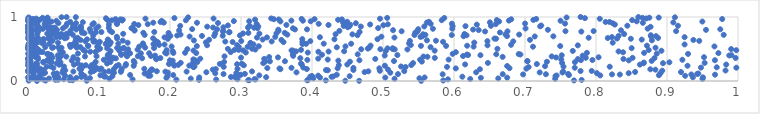
| Category | Series 0 |
|---|---|
| 0.012581434079411397 | 0.001 |
| 0.5538194736224774 | 0.002 |
| 0.4664493394655366 | 0.003 |
| 0.4468543801785446 | 0.004 |
| 0.08261566202539482 | 0.005 |
| 0.0010166043889414363 | 0.006 |
| 0.024758491668473725 | 0.007 |
| 0.5847515967661855 | 0.008 |
| 0.7690344453760237 | 0.009 |
| 0.41945659897998555 | 0.01 |
| 0.3933090043632396 | 0.011 |
| 0.06285149333932596 | 0.012 |
| 0.3113833984330481 | 0.013 |
| 0.310170372640802 | 0.014 |
| 0.05865643473802186 | 0.015 |
| 0.39425686358414147 | 0.016 |
| 0.7797838025706793 | 0.017 |
| 0.03859763547927318 | 0.018 |
| 0.24080832496385804 | 0.019 |
| 0.04246517612462469 | 0.02 |
| 0.2089240261262518 | 0.021 |
| 0.02197612507937619 | 0.022 |
| 0.2650255789797198 | 0.023 |
| 0.3203731093125201 | 0.024 |
| 0.14731440239198895 | 0.025 |
| 0.5914334222539293 | 0.026 |
| 0.29498436131448014 | 0.027 |
| 0.050445300946891626 | 0.028 |
| 0.31902909096392407 | 0.029 |
| 0.012850995288153987 | 0.03 |
| 0.6228479075087195 | 0.031 |
| 0.950010506703682 | 0.032 |
| 0.1146795055342006 | 0.033 |
| 0.7425315621230358 | 0.034 |
| 0.5162380187441156 | 0.035 |
| 0.0033428228536305114 | 0.036 |
| 0.01747380808025769 | 0.037 |
| 0.22919382733326896 | 0.038 |
| 0.029613520234972913 | 0.039 |
| 0.6623364581365054 | 0.04 |
| 0.007069242463207229 | 0.041 |
| 0.40186333689762455 | 0.042 |
| 0.551297612471121 | 0.043 |
| 0.012989911877206434 | 0.044 |
| 0.08720304127235276 | 0.045 |
| 0.00706980782309655 | 0.046 |
| 0.0029586530379909987 | 0.047 |
| 0.06806486046594251 | 0.048 |
| 0.6378143108307986 | 0.049 |
| 0.1949242988515982 | 0.05 |
| 0.00017795972893022713 | 0.051 |
| 0.6749065318323275 | 0.052 |
| 0.41139221672633464 | 0.053 |
| 0.503280811965432 | 0.054 |
| 0.5585929923488544 | 0.055 |
| 0.24119429200655532 | 0.056 |
| 0.9506356673355246 | 0.057 |
| 0.9364822103862095 | 0.058 |
| 0.0005937504475656386 | 0.059 |
| 0.3354318650730736 | 0.06 |
| 0.05950167390177529 | 0.061 |
| 0.04240312464686263 | 0.062 |
| 0.2858547062032555 | 0.063 |
| 0.07508410018639351 | 0.064 |
| 0.2907413889545441 | 0.065 |
| 0.42751740025988744 | 0.066 |
| 0.6117655469948821 | 0.067 |
| 0.39749271699452754 | 0.068 |
| 0.10890117142855124 | 0.069 |
| 0.10730151094975639 | 0.07 |
| 0.42988067750121084 | 0.071 |
| 0.07989425513882156 | 0.072 |
| 0.03745684691579967 | 0.073 |
| 0.1188334101952559 | 0.074 |
| 0.4530114622472979 | 0.075 |
| 0.7429023975543911 | 0.076 |
| 0.19647130532613596 | 0.077 |
| 0.39993865691761016 | 0.078 |
| 0.01633262687449137 | 0.079 |
| 0.16963053016370105 | 0.08 |
| 0.9255765031332096 | 0.081 |
| 0.03853822289271652 | 0.082 |
| 0.17221440593889042 | 0.083 |
| 0.4087745203561707 | 0.084 |
| 0.05215563329953348 | 0.085 |
| 0.7445801615364339 | 0.086 |
| 0.8059731122825438 | 0.087 |
| 0.3257499675803352 | 0.088 |
| 0.10204851133703091 | 0.089 |
| 0.8886149886724063 | 0.09 |
| 0.07744483613944522 | 0.091 |
| 0.7619290545455858 | 0.092 |
| 0.20453517952880634 | 0.093 |
| 0.14381610714956128 | 0.094 |
| 0.2974567895285575 | 0.095 |
| 0.2995397390967571 | 0.096 |
| 0.03843459295786345 | 0.097 |
| 0.4348947528751762 | 0.098 |
| 0.9676483794696745 | 0.099 |
| 0.008055413522605038 | 0.1 |
| 0.8335623716036511 | 0.101 |
| 0.9342890892012924 | 0.102 |
| 0.6973431486477115 | 0.103 |
| 0.8225620943025177 | 0.104 |
| 0.5840497402832733 | 0.105 |
| 0.7295063762891945 | 0.106 |
| 0.668655944358996 | 0.107 |
| 0.5211262440573501 | 0.108 |
| 0.2754180118546329 | 0.109 |
| 0.7608063385233927 | 0.11 |
| 0.9425319611843659 | 0.111 |
| 0.3054265766629343 | 0.112 |
| 0.07494758263449297 | 0.113 |
| 0.02085284153053956 | 0.114 |
| 0.03620909485804156 | 0.115 |
| 0.9441923524318065 | 0.116 |
| 0.1642816373743866 | 0.117 |
| 0.007417860769580063 | 0.118 |
| 0.040691293494025865 | 0.119 |
| 0.8906998287350578 | 0.12 |
| 0.2637165760580508 | 0.121 |
| 0.8460575308191575 | 0.122 |
| 0.8012734279430845 | 0.123 |
| 0.16917298104304904 | 0.124 |
| 0.01714159025865894 | 0.125 |
| 0.29346674398212746 | 0.126 |
| 0.024049655183445533 | 0.127 |
| 0.12108354938659473 | 0.128 |
| 0.11964376175294074 | 0.129 |
| 0.5102932257623926 | 0.13 |
| 0.048472913450156516 | 0.131 |
| 0.1969455250620777 | 0.132 |
| 0.7527511213553173 | 0.133 |
| 0.7207196398709985 | 0.134 |
| 0.378145506992356 | 0.135 |
| 0.631197691657521 | 0.136 |
| 0.2512180726015382 | 0.137 |
| 0.08848176027001367 | 0.138 |
| 0.47411784371210614 | 0.139 |
| 0.9196904304702097 | 0.14 |
| 0.8550762286663652 | 0.141 |
| 0.10739566346987751 | 0.142 |
| 0.1307888737396675 | 0.143 |
| 0.00030816658246248126 | 0.144 |
| 0.0007032087130229858 | 0.145 |
| 0.19347935526516907 | 0.146 |
| 0.22338583921236957 | 0.147 |
| 0.06389154103413666 | 0.148 |
| 0.7537548980069192 | 0.149 |
| 0.3155518724068487 | 0.15 |
| 0.4793322341884036 | 0.151 |
| 0.18142549004612657 | 0.152 |
| 0.11377062968566096 | 0.153 |
| 0.5299308196030017 | 0.154 |
| 0.09205335238922135 | 0.155 |
| 0.7782153040349252 | 0.156 |
| 0.7939581275133886 | 0.157 |
| 0.17255612345021165 | 0.158 |
| 0.4955845056315014 | 0.159 |
| 0.09206612383884193 | 0.16 |
| 0.8933776172150731 | 0.161 |
| 0.13128149056429153 | 0.162 |
| 0.00019791458523630412 | 0.163 |
| 0.9824238294439412 | 0.164 |
| 0.0049687484273614885 | 0.165 |
| 0.0007911338053830643 | 0.166 |
| 0.05247410602832227 | 0.167 |
| 0.4222983018533972 | 0.168 |
| 0.01004101453171678 | 0.169 |
| 0.049634733170429754 | 0.17 |
| 0.41968921832171285 | 0.171 |
| 0.458264008298881 | 0.172 |
| 0.022218914908795684 | 0.173 |
| 0.012593616295164808 | 0.174 |
| 0.07455026880846499 | 0.175 |
| 0.1750818903087035 | 0.176 |
| 0.8836827338228469 | 0.177 |
| 0.2601874250853314 | 0.178 |
| 0.095178963984406 | 0.179 |
| 0.5069773890742963 | 0.18 |
| 0.17397302961643638 | 0.181 |
| 0.10071915651797418 | 0.182 |
| 0.876557068386204 | 0.183 |
| 0.6365037242309203 | 0.184 |
| 0.355502003406669 | 0.185 |
| 0.26454042890048035 | 0.186 |
| 0.3927389987936996 | 0.187 |
| 0.12111307415190836 | 0.188 |
| 0.29503306386297123 | 0.189 |
| 0.16379316620132925 | 0.19 |
| 0.13212216149486988 | 0.191 |
| 0.07251520500274967 | 0.192 |
| 0.7019222432567591 | 0.193 |
| 0.016913743210987812 | 0.194 |
| 0.10330275681175444 | 0.195 |
| 0.3542050630829755 | 0.196 |
| 0.6025401008303343 | 0.197 |
| 0.4948373451801721 | 0.198 |
| 0.43609644825435645 | 0.199 |
| 0.6781635577964578 | 0.2 |
| 0.008213165632396205 | 0.201 |
| 0.3370230214315787 | 0.202 |
| 0.03575453223931389 | 0.203 |
| 0.09672280842865198 | 0.204 |
| 0.45834518517073625 | 0.205 |
| 0.37112105195757855 | 0.206 |
| 0.7700771322013626 | 0.207 |
| 0.9976909936810304 | 0.208 |
| 0.9478475068172126 | 0.209 |
| 0.38771288679712407 | 0.21 |
| 0.006269122789394137 | 0.211 |
| 0.09240299450096585 | 0.212 |
| 0.07610678991241801 | 0.213 |
| 0.9700665767342941 | 0.214 |
| 0.00905527867136349 | 0.215 |
| 0.08792609948814124 | 0.216 |
| 0.23304592974763955 | 0.217 |
| 0.7051339452213632 | 0.218 |
| 0.531778154267415 | 0.219 |
| 0.590164816329501 | 0.22 |
| 0.27565835263729793 | 0.221 |
| 0.23364495212235062 | 0.222 |
| 0.8193492968030194 | 0.223 |
| 0.026281994100187556 | 0.224 |
| 0.7542313132704289 | 0.225 |
| 0.050701993484478576 | 0.226 |
| 0.5254403621727769 | 0.227 |
| 0.23449056243968408 | 0.228 |
| 0.03179812260704799 | 0.229 |
| 0.012482196371142487 | 0.23 |
| 0.07642437205369088 | 0.231 |
| 0.7282040830829382 | 0.232 |
| 0.12437340004297491 | 0.233 |
| 0.6748804849560749 | 0.234 |
| 0.010089866754524281 | 0.235 |
| 0.008921516322956347 | 0.236 |
| 0.1488743014055665 | 0.237 |
| 0.9288767307330449 | 0.238 |
| 0.5026469201038923 | 0.239 |
| 0.2061158629732965 | 0.24 |
| 0.2271703796641308 | 0.241 |
| 0.0754952279919915 | 0.242 |
| 0.13750996452744152 | 0.243 |
| 1.0445862282019075e-05 | 0.244 |
| 0.3040107439965842 | 0.245 |
| 0.08139553673333146 | 0.246 |
| 0.08971984596676692 | 0.247 |
| 0.43781422514903306 | 0.248 |
| 0.5397913389932462 | 0.249 |
| 0.12752032922379705 | 0.25 |
| 0.21151289592831607 | 0.251 |
| 0.20574674978989657 | 0.252 |
| 0.0037786057623916984 | 0.253 |
| 0.043865878890794824 | 0.254 |
| 0.06465621029014179 | 0.255 |
| 0.861827787427295 | 0.256 |
| 0.9834147403019973 | 0.257 |
| 0.44968844010401665 | 0.258 |
| 0.6156592695310202 | 0.259 |
| 0.38554434213948185 | 0.26 |
| 0.0016049904433711427 | 0.261 |
| 0.2944924626190693 | 0.262 |
| 0.044895342461789556 | 0.263 |
| 0.1379845442423468 | 0.264 |
| 0.71667105620725 | 0.265 |
| 0.19854395430168315 | 0.266 |
| 0.2701784735666394 | 0.267 |
| 0.0934605409516154 | 0.268 |
| 0.012709532093430021 | 0.269 |
| 0.30129828007722287 | 0.27 |
| 0.3844878306602717 | 0.271 |
| 0.011348462604640196 | 0.272 |
| 0.11140002536359822 | 0.273 |
| 0.0017135785463877565 | 0.274 |
| 0.07010343499366992 | 0.275 |
| 0.04045470850809035 | 0.276 |
| 0.8670108793037671 | 0.277 |
| 0.8944050516218193 | 0.278 |
| 0.3313562370627558 | 0.279 |
| 0.5423232985950744 | 0.28 |
| 0.7522809356274591 | 0.281 |
| 0.6477664904211448 | 0.282 |
| 0.9530221476488419 | 0.283 |
| 0.21510017183267277 | 0.284 |
| 0.15007701477251098 | 0.285 |
| 0.00020541943689425952 | 0.286 |
| 0.23251464391297202 | 0.287 |
| 0.8674258255197851 | 0.288 |
| 0.03336421455437137 | 0.289 |
| 0.021587630161964983 | 0.29 |
| 0.003101034948556946 | 0.291 |
| 0.9033552173611546 | 0.292 |
| 0.0014747706429798545 | 0.293 |
| 0.04567055234585086 | 0.294 |
| 0.7703513923870143 | 0.295 |
| 0.2384293709471788 | 0.296 |
| 0.11605669080383997 | 0.297 |
| 0.27621992669076423 | 0.298 |
| 0.021661066042526267 | 0.299 |
| 0.09525375170481956 | 0.3 |
| 0.730881959087536 | 0.301 |
| 0.4534629626353132 | 0.302 |
| 0.5547066921038231 | 0.303 |
| 0.03226021643383538 | 0.304 |
| 0.031098304707074448 | 0.305 |
| 0.33445228064160254 | 0.306 |
| 0.34072013177476845 | 0.307 |
| 0.003687166493080831 | 0.308 |
| 0.36192826323732635 | 0.309 |
| 0.7032047552450537 | 0.31 |
| 0.7034611487784266 | 0.311 |
| 0.5154997416480286 | 0.312 |
| 0.14893198189567652 | 0.313 |
| 0.8784403753174854 | 0.314 |
| 0.002994644461445537 | 0.315 |
| 0.02743870202164287 | 0.316 |
| 0.20376953967744077 | 0.317 |
| 0.4370883684464224 | 0.318 |
| 0.2351228697374031 | 0.319 |
| 0.06162834432871178 | 0.32 |
| 0.2358072134558691 | 0.321 |
| 0.8461487921980668 | 0.322 |
| 0.19978473921829235 | 0.323 |
| 0.4668154677361719 | 0.324 |
| 0.967493819960503 | 0.325 |
| 0.7787911060338366 | 0.326 |
| 0.02759594610872393 | 0.327 |
| 0.7950054861749652 | 0.328 |
| 0.0004465230384604553 | 0.329 |
| 0.39342933611852926 | 0.33 |
| 0.10681438797112862 | 0.331 |
| 0.9216555226761676 | 0.332 |
| 0.5522815938946576 | 0.333 |
| 0.592440581276513 | 0.334 |
| 0.4221631609763822 | 0.335 |
| 0.06981611677677754 | 0.336 |
| 0.7510920062203723 | 0.337 |
| 0.2329031270697404 | 0.338 |
| 0.043131607558559715 | 0.339 |
| 0.02932825370022123 | 0.34 |
| 0.18073186651716092 | 0.341 |
| 0.014140072820743008 | 0.342 |
| 0.7744070319260378 | 0.343 |
| 0.8386982987757198 | 0.344 |
| 0.48908951411621715 | 0.345 |
| 0.3326660552236945 | 0.346 |
| 6.656076544925635e-05 | 0.347 |
| 0.11406214036593443 | 0.348 |
| 0.24263252972400137 | 0.349 |
| 0.4087914205618755 | 0.35 |
| 0.043109418887151287 | 0.351 |
| 0.18018247182776514 | 0.352 |
| 0.0002474622673515646 | 0.353 |
| 0.12381045866316374 | 0.354 |
| 0.1200430799244422 | 0.355 |
| 0.16070399890359674 | 0.356 |
| 0.38353351999559265 | 0.357 |
| 0.8824043456850096 | 0.358 |
| 0.18646406109542427 | 0.359 |
| 0.9966589295763052 | 0.36 |
| 0.572939847427444 | 0.361 |
| 0.8515424826437293 | 0.362 |
| 0.7856296713658288 | 0.363 |
| 0.1197401166045033 | 0.364 |
| 0.30007365274201936 | 0.365 |
| 0.03439498095645414 | 0.366 |
| 0.013772520890541515 | 0.367 |
| 0.743748578249055 | 0.368 |
| 0.35209512480684324 | 0.369 |
| 0.004468867543278422 | 0.37 |
| 0.8036354603194487 | 0.371 |
| 0.9521508502421042 | 0.372 |
| 0.06401637506073996 | 0.373 |
| 0.33967702578897635 | 0.374 |
| 0.010355571030661745 | 0.375 |
| 0.04508086627528332 | 0.376 |
| 0.6684908133844412 | 0.377 |
| 0.11389437108310903 | 0.378 |
| 0.5625976615770862 | 0.379 |
| 0.11232155790429857 | 0.38 |
| 0.05395426237932181 | 0.381 |
| 0.5569553580433962 | 0.382 |
| 0.08022651498934324 | 0.383 |
| 0.7376017941642897 | 0.384 |
| 0.27677606553775275 | 0.385 |
| 0.13952653481358818 | 0.386 |
| 0.09646579815983286 | 0.387 |
| 0.15471870812352548 | 0.388 |
| 0.046268142412812525 | 0.389 |
| 0.6127848641716116 | 0.39 |
| 0.17310154419938947 | 0.391 |
| 0.04589232805736358 | 0.392 |
| 0.37345852389487033 | 0.393 |
| 0.03272123451292149 | 0.394 |
| 0.002506862376250571 | 0.395 |
| 0.7812178474649258 | 0.396 |
| 0.1790197568071549 | 0.397 |
| 0.5024272716739664 | 0.398 |
| 0.9876825223499335 | 0.399 |
| 0.04481906724936492 | 0.4 |
| 0.04192986303514519 | 0.401 |
| 0.7517381867672586 | 0.402 |
| 0.6372333019358342 | 0.403 |
| 0.9908105489940554 | 0.404 |
| 0.520239265411293 | 0.405 |
| 0.6198336424333483 | 0.406 |
| 0.11236305345754818 | 0.407 |
| 0.004752807901323878 | 0.408 |
| 0.032174931042634615 | 0.409 |
| 0.41407933117568163 | 0.41 |
| 0.1313890213092158 | 0.411 |
| 0.13123459325368328 | 0.412 |
| 0.6182104840797802 | 0.413 |
| 0.6935832758249357 | 0.414 |
| 0.0021480030658952813 | 0.415 |
| 0.37300040767077497 | 0.416 |
| 0.4643751109635483 | 0.417 |
| 0.659506089727157 | 0.418 |
| 0.13743749722465795 | 0.419 |
| 0.027043025698371224 | 0.42 |
| 0.691160357315924 | 0.421 |
| 0.11427622246771706 | 0.422 |
| 0.9296571233368158 | 0.423 |
| 0.5981330360997653 | 0.424 |
| 0.028119640798217833 | 0.425 |
| 0.0002009990864660178 | 0.426 |
| 0.01217153817379515 | 0.427 |
| 0.885616826445664 | 0.428 |
| 0.07034174103967981 | 0.429 |
| 0.19505724323839568 | 0.43 |
| 0.012013646669209838 | 0.431 |
| 0.1437915876516646 | 0.432 |
| 0.1590108802303371 | 0.433 |
| 0.1706204582970935 | 0.434 |
| 0.13816011721006657 | 0.435 |
| 0.9724310081831574 | 0.436 |
| 0.23691609521807058 | 0.437 |
| 0.20470208577388055 | 0.438 |
| 0.867745930549284 | 0.439 |
| 0.7872069789573993 | 0.44 |
| 0.22125430911395527 | 0.441 |
| 0.19319045854514225 | 0.442 |
| 0.0025548147577089376 | 0.443 |
| 0.394049941967496 | 0.444 |
| 0.3067838154748878 | 0.445 |
| 0.049140962300966755 | 0.446 |
| 0.04740776625635126 | 0.447 |
| 0.01058862270592869 | 0.448 |
| 0.8381170848086897 | 0.449 |
| 0.6025576612046633 | 0.45 |
| 0.2855176218928045 | 0.451 |
| 0.00819933781035038 | 0.452 |
| 0.02058288452901869 | 0.453 |
| 0.017713396959299365 | 0.454 |
| 0.09494452874858109 | 0.455 |
| 0.010276128993937799 | 0.456 |
| 0.40900252537097126 | 0.457 |
| 0.08766161976650044 | 0.458 |
| 0.012479987009747196 | 0.459 |
| 0.42334428810149327 | 0.46 |
| 0.012152537842538755 | 0.461 |
| 0.8317808661933186 | 0.462 |
| 0.37743278932767166 | 0.463 |
| 0.0806281028657759 | 0.464 |
| 0.44530155451471165 | 0.465 |
| 0.2038002487265977 | 0.466 |
| 0.5037801685450544 | 0.467 |
| 0.11625612037177725 | 0.468 |
| 0.008896700845244802 | 0.469 |
| 0.7673189028618945 | 0.47 |
| 0.00242815930355924 | 0.471 |
| 0.12896710268666922 | 0.472 |
| 0.8921893313986502 | 0.473 |
| 0.572739849540714 | 0.474 |
| 0.3731235103510928 | 0.475 |
| 0.2330830547865501 | 0.476 |
| 0.3711696390886404 | 0.477 |
| 0.3031131323600161 | 0.478 |
| 0.12868455587957317 | 0.479 |
| 0.044938784270863515 | 0.48 |
| 0.9975912065275934 | 0.481 |
| 0.1952520906342035 | 0.482 |
| 0.01526319306662169 | 0.483 |
| 0.8742608258371111 | 0.484 |
| 0.29061953511145777 | 0.485 |
| 0.3845560751766525 | 0.486 |
| 0.2967929493725396 | 0.487 |
| 0.09841175916320871 | 0.488 |
| 0.07762584833919736 | 0.489 |
| 0.00349198992869359 | 0.49 |
| 0.15431354007370238 | 0.491 |
| 0.32020405068746866 | 0.492 |
| 0.5344027233279114 | 0.493 |
| 0.5165208642228036 | 0.494 |
| 0.14111723920776748 | 0.495 |
| 0.46933223064426666 | 0.496 |
| 0.4962392417294962 | 0.497 |
| 0.22438194483216348 | 0.498 |
| 0.9903812328238426 | 0.499 |
| 0.5137497339261514 | 0.5 |
| 2.7008185686056273e-05 | 0.501 |
| 0.28153916201578244 | 0.502 |
| 0.6611341630540511 | 0.503 |
| 0.3156281091034099 | 0.504 |
| 0.10152237348559821 | 0.505 |
| 0.0040185111034804185 | 0.506 |
| 0.4785731100549961 | 0.507 |
| 0.01275221395232401 | 0.508 |
| 0.12876295802490498 | 0.509 |
| 0.506373796323686 | 0.51 |
| 0.11150051045320426 | 0.511 |
| 0.5136612438339421 | 0.512 |
| 0.8501841192561295 | 0.513 |
| 0.13427067318379873 | 0.514 |
| 0.17750177741452888 | 0.515 |
| 0.1351015258194117 | 0.516 |
| 0.1254934068711205 | 0.517 |
| 0.03396756258523213 | 0.518 |
| 0.047177826324810795 | 0.519 |
| 0.8837845808344583 | 0.52 |
| 0.1649663270376515 | 0.521 |
| 0.06863114998302072 | 0.522 |
| 0.4808786387570427 | 0.523 |
| 0.002460079075891721 | 0.524 |
| 0.035555149765196 | 0.525 |
| 0.04266070073898387 | 0.526 |
| 0.43497534469335974 | 0.527 |
| 1.2544516635403586e-07 | 0.528 |
| 0.5669531909403002 | 0.529 |
| 0.024230233264587064 | 0.53 |
| 0.07365741823756292 | 0.531 |
| 0.05989838035207977 | 0.532 |
| 0.29678771653183184 | 0.533 |
| 0.3092935831956216 | 0.534 |
| 0.09755744337168039 | 0.535 |
| 0.7112406077316628 | 0.536 |
| 0.6275789455882548 | 0.537 |
| 0.15667128890908796 | 0.538 |
| 0.2022929945652702 | 0.539 |
| 0.9668318937678789 | 0.54 |
| 0.4471602349456463 | 0.541 |
| 0.007158359396786757 | 0.542 |
| 0.3250597933319224 | 0.543 |
| 0.06679188244616846 | 0.544 |
| 0.23781483222348096 | 0.545 |
| 0.7495868689592525 | 0.546 |
| 0.08491500479900416 | 0.547 |
| 0.5888399264566122 | 0.548 |
| 0.5534989940863848 | 0.549 |
| 0.084333786016948 | 0.55 |
| 0.6184853679264245 | 0.551 |
| 0.8717419712289797 | 0.552 |
| 0.48256061360485875 | 0.553 |
| 0.0022643504629409708 | 0.554 |
| 0.001393659765065636 | 0.555 |
| 0.0003551639812996333 | 0.556 |
| 0.7743730413020442 | 0.557 |
| 0.6471518247359833 | 0.558 |
| 0.25221168967661184 | 0.559 |
| 0.29447501344344956 | 0.56 |
| 0.06071776375538645 | 0.561 |
| 0.5391902536226146 | 0.562 |
| 0.05904869893271577 | 0.563 |
| 0.18458615419384505 | 0.564 |
| 0.680373486930137 | 0.565 |
| 0.16257958559907712 | 0.566 |
| 0.06487797204990436 | 0.567 |
| 0.008782193819954418 | 0.568 |
| 0.11484905529178632 | 0.569 |
| 0.19229662240876905 | 0.57 |
| 0.9247848647922338 | 0.571 |
| 0.3175909563628653 | 0.572 |
| 0.06770850331749349 | 0.573 |
| 0.1783673726043274 | 0.574 |
| 0.0990024264458998 | 0.575 |
| 0.17670804564788734 | 0.576 |
| 0.3865960422370373 | 0.577 |
| 0.10949342563198959 | 0.578 |
| 0.000989182187304789 | 0.579 |
| 0.02987968440184631 | 0.58 |
| 0.39168157590226577 | 0.581 |
| 0.4551325342378195 | 0.582 |
| 0.41655371071751707 | 0.583 |
| 0.1272111597671132 | 0.584 |
| 0.009866565435641765 | 0.585 |
| 0.18077922718857978 | 0.586 |
| 0.16191557971092477 | 0.587 |
| 0.5366589488966552 | 0.588 |
| 0.020338746201053443 | 0.589 |
| 0.31344856270863425 | 0.59 |
| 0.011786713459685861 | 0.591 |
| 0.11037453890010082 | 0.592 |
| 0.0016282190820744104 | 0.593 |
| 0.021798823523156007 | 0.594 |
| 0.06641469909709989 | 0.595 |
| 0.31343516434341 | 0.596 |
| 0.042316357180012705 | 0.597 |
| 0.14037198915000684 | 0.598 |
| 0.823555226854701 | 0.599 |
| 0.6285663034177729 | 0.6 |
| 0.003601301222149551 | 0.601 |
| 0.06698275664581305 | 0.602 |
| 0.11646620165288518 | 0.603 |
| 0.2504900441494716 | 0.604 |
| 0.018384924853377255 | 0.605 |
| 0.18291617559522483 | 0.606 |
| 0.0205472579334403 | 0.607 |
| 0.35988388747443034 | 0.608 |
| 0.288236492426218 | 0.609 |
| 0.3865054170076506 | 0.61 |
| 0.006356606861371437 | 0.611 |
| 0.5845867980003674 | 0.612 |
| 0.10107999734058767 | 0.613 |
| 0.11429711298186963 | 0.614 |
| 0.09222061873638505 | 0.615 |
| 0.2778427749879723 | 0.616 |
| 0.06682907419793709 | 0.617 |
| 0.3431984962523807 | 0.618 |
| 0.6834468831869052 | 0.619 |
| 0.09465053112679285 | 0.62 |
| 0.08068737267103566 | 0.621 |
| 0.6470460667415584 | 0.622 |
| 0.3976502557528335 | 0.623 |
| 0.032840106020423046 | 0.624 |
| 0.30037088366421955 | 0.625 |
| 0.5379453735466224 | 0.626 |
| 0.9454120776841335 | 0.627 |
| 0.1797804890886285 | 0.628 |
| 0.5745880568345424 | 0.629 |
| 0.034590561083727225 | 0.63 |
| 0.13347956701232336 | 0.631 |
| 0.11318219854041743 | 0.632 |
| 0.007390454499906745 | 0.633 |
| 0.23367487317768787 | 0.634 |
| 0.5618826347096296 | 0.635 |
| 0.8787247460522393 | 0.636 |
| 0.004149392503423834 | 0.637 |
| 0.03247141949898762 | 0.638 |
| 0.01122244191639832 | 0.639 |
| 0.07397850667725289 | 0.64 |
| 0.9371761400002959 | 0.641 |
| 0.35690486051685494 | 0.642 |
| 0.7070353665914396 | 0.643 |
| 0.25516841272942853 | 0.644 |
| 0.009990665289809929 | 0.645 |
| 0.0019375580730130384 | 0.646 |
| 0.8644472061929568 | 0.647 |
| 0.3304736327842714 | 0.648 |
| 0.11239323489567546 | 0.649 |
| 0.021442848956863787 | 0.65 |
| 0.08317411043244576 | 0.651 |
| 0.4316090501026717 | 0.652 |
| 0.4922264135192865 | 0.653 |
| 0.022353067133414083 | 0.654 |
| 0.3863267890785989 | 0.655 |
| 0.09133450579647451 | 0.656 |
| 0.06870456982249741 | 0.657 |
| 0.0008780833515450106 | 0.658 |
| 0.19690913291779344 | 0.659 |
| 0.8490517861426911 | 0.66 |
| 0.6593474749006861 | 0.661 |
| 0.0672930550688723 | 0.662 |
| 0.656973286868629 | 0.663 |
| 0.8296789203671258 | 0.664 |
| 0.12559122655190777 | 0.665 |
| 0.028359065404842072 | 0.666 |
| 0.17626860270188777 | 0.667 |
| 0.05185000204047743 | 0.668 |
| 0.0002537138240304748 | 0.669 |
| 0.014028585284681918 | 0.67 |
| 0.8165981850776994 | 0.671 |
| 0.003101087926222741 | 0.672 |
| 0.887417535678209 | 0.673 |
| 0.0023978166154357636 | 0.674 |
| 0.06990891582683706 | 0.675 |
| 0.789659889918876 | 0.676 |
| 0.05442940384175097 | 0.677 |
| 0.32252531271821694 | 0.678 |
| 0.5161329834829284 | 0.679 |
| 0.01339706954725312 | 0.68 |
| 0.3365712251964452 | 0.681 |
| 0.19226350055603975 | 0.682 |
| 0.0400414642802346 | 0.683 |
| 0.4111605627054476 | 0.684 |
| 0.9247711690845423 | 0.685 |
| 0.8224921693878503 | 0.686 |
| 0.045079166542365656 | 0.687 |
| 0.031899111640851595 | 0.688 |
| 0.552866129424086 | 0.689 |
| 0.34827311353853196 | 0.69 |
| 0.12514725681284194 | 0.691 |
| 0.04994714059453557 | 0.692 |
| 0.49778853586515653 | 0.693 |
| 0.19679071908235465 | 0.694 |
| 0.22762331002377895 | 0.695 |
| 0.7137430653395026 | 0.696 |
| 0.8775705472871931 | 0.697 |
| 0.7399516595191536 | 0.698 |
| 0.5556303909242218 | 0.699 |
| 0.6134498790406635 | 0.7 |
| 0.8845568010567526 | 0.701 |
| 0.6746826932929878 | 0.702 |
| 0.2005012943741931 | 0.703 |
| 0.2450428908488636 | 0.704 |
| 0.8318528116768181 | 0.705 |
| 0.26235902342085093 | 0.706 |
| 0.2742389176198049 | 0.707 |
| 0.0005559412727707832 | 0.708 |
| 0.04056737492287589 | 0.709 |
| 0.09185794837075889 | 0.71 |
| 0.2101264196143114 | 0.711 |
| 0.2984593947970008 | 0.712 |
| 0.005804334344450438 | 0.713 |
| 0.6176470455172576 | 0.714 |
| 0.87720444749174 | 0.715 |
| 0.4640782363813913 | 0.716 |
| 0.001480557942229935 | 0.717 |
| 0.596879942010595 | 0.718 |
| 0.5443148794864687 | 0.719 |
| 0.1642977928005066 | 0.72 |
| 0.9798866259397231 | 0.721 |
| 0.5596673067570118 | 0.722 |
| 0.06302800078517495 | 0.723 |
| 0.36527687970465383 | 0.724 |
| 0.6917887500582847 | 0.725 |
| 0.21478588492467737 | 0.726 |
| 0.04643457591285871 | 0.727 |
| 0.6724273438812335 | 0.728 |
| 0.4568979955932419 | 0.729 |
| 0.5563925803165259 | 0.73 |
| 0.03382779270811229 | 0.731 |
| 0.43321738653378267 | 0.732 |
| 0.047234426255919164 | 0.733 |
| 0.8396338735998817 | 0.734 |
| 0.6148066831498045 | 0.735 |
| 0.041648730370585946 | 0.736 |
| 0.13407198049924826 | 0.737 |
| 0.013256546873569919 | 0.738 |
| 0.05412473385676994 | 0.739 |
| 0.32589076059331984 | 0.74 |
| 0.027110903638095898 | 0.741 |
| 0.0028300233291403292 | 0.742 |
| 0.3029297924327206 | 0.743 |
| 0.34988569171036193 | 0.744 |
| 0.26365402625163586 | 0.745 |
| 0.07950811878235024 | 0.746 |
| 0.004109055120823969 | 0.747 |
| 0.057996097464861916 | 0.748 |
| 0.059224746117559304 | 0.749 |
| 0.19793222168235114 | 0.75 |
| 0.3103589300951683 | 0.751 |
| 0.3616465001029855 | 0.752 |
| 0.16243618510840774 | 0.753 |
| 0.07597367967488629 | 0.754 |
| 0.0006739898537507684 | 0.755 |
| 1.5182464820940274e-05 | 0.756 |
| 0.5454966422918877 | 0.757 |
| 0.6646858777042006 | 0.758 |
| 0.09540624293247081 | 0.759 |
| 0.005038403935505263 | 0.76 |
| 0.004005015418608365 | 0.761 |
| 0.2832161401583111 | 0.762 |
| 0.28385116975386193 | 0.763 |
| 0.11840747808686035 | 0.764 |
| 0.10337233677149624 | 0.765 |
| 0.17786820550054533 | 0.766 |
| 0.467088640760295 | 0.767 |
| 0.5479761105392117 | 0.768 |
| 0.08823081546340679 | 0.769 |
| 0.2746991019071104 | 0.77 |
| 8.038698975769769e-05 | 0.771 |
| 0.7793317270198913 | 0.772 |
| 0.0332112868612776 | 0.773 |
| 0.643796127197003 | 0.774 |
| 0.03749336920382877 | 0.775 |
| 0.6753589991414891 | 0.776 |
| 0.526224377887419 | 0.777 |
| 0.7570057561742198 | 0.778 |
| 0.9128317003614433 | 0.779 |
| 0.7966577626360669 | 0.78 |
| 0.0026904428658327223 | 0.781 |
| 0.014840502121405542 | 0.782 |
| 0.4385420328046869 | 0.783 |
| 0.2749102930015548 | 0.784 |
| 0.3528729540777602 | 0.785 |
| 0.11527863155096266 | 0.786 |
| 0.0015591782422169256 | 0.787 |
| 0.15003581604719446 | 0.788 |
| 0.05987121626701477 | 0.789 |
| 0.5490789189122502 | 0.79 |
| 0.21280610429957034 | 0.791 |
| 0.8352299412313713 | 0.792 |
| 0.006491573267701304 | 0.793 |
| 0.5141695748628978 | 0.794 |
| 0.14992739661039595 | 0.795 |
| 0.6347925666613868 | 0.796 |
| 0.040893387202586895 | 0.797 |
| 0.011297405437552498 | 0.798 |
| 0.954938241424452 | 0.799 |
| 0.7322567232253229 | 0.8 |
| 0.07505749368287526 | 0.801 |
| 0.35249297769522353 | 0.802 |
| 0.004737520645340333 | 0.803 |
| 0.6269118982423671 | 0.804 |
| 0.067995640557142 | 0.805 |
| 0.3759899600662357 | 0.806 |
| 0.39296948657843045 | 0.807 |
| 0.9750524945195074 | 0.808 |
| 0.26635191508846073 | 0.809 |
| 0.5496213888258605 | 0.81 |
| 0.2311768475885976 | 0.811 |
| 0.0870821326901439 | 0.812 |
| 0.00010405138999012945 | 0.813 |
| 0.028546422112310038 | 0.814 |
| 0.021006517865911168 | 0.815 |
| 0.5702964323401528 | 0.816 |
| 0.5976083124797715 | 0.817 |
| 0.8727189150049505 | 0.818 |
| 0.09600452458466636 | 0.819 |
| 0.0048749267274564075 | 0.82 |
| 0.7007817792055062 | 0.821 |
| 0.02918363814691733 | 0.822 |
| 0.04915911342543424 | 0.823 |
| 0.37314337980765167 | 0.824 |
| 0.323220974165874 | 0.825 |
| 0.14575861266497087 | 0.826 |
| 0.4931378489382671 | 0.827 |
| 0.015325743686017608 | 0.828 |
| 0.14719739397010598 | 0.829 |
| 0.03344942852410444 | 0.83 |
| 0.11377853086458864 | 0.831 |
| 0.3183627113836721 | 0.832 |
| 0.06611022345573268 | 0.833 |
| 0.30985011783243055 | 0.834 |
| 0.26069572186004947 | 0.835 |
| 0.03788018922663549 | 0.836 |
| 0.0021860085408643144 | 0.837 |
| 0.03150441212841955 | 0.838 |
| 0.2751689943203889 | 0.839 |
| 0.00012273797397826776 | 0.84 |
| 0.45042021983893976 | 0.841 |
| 0.029871438157671425 | 0.842 |
| 0.003931877862655367 | 0.843 |
| 0.06321903391147594 | 0.844 |
| 0.07384974717737555 | 0.845 |
| 0.07476578445995813 | 0.846 |
| 0.876857674663461 | 0.847 |
| 0.015024290109018647 | 0.848 |
| 0.252440810059127 | 0.849 |
| 0.09913830472744886 | 0.85 |
| 0.4688019105106273 | 0.851 |
| 0.5581363826573015 | 0.852 |
| 0.3243088258705661 | 0.853 |
| 0.452573295962885 | 0.854 |
| 0.721360552961216 | 0.855 |
| 0.02681947331317547 | 0.856 |
| 0.6161965173126401 | 0.857 |
| 0.5980840904456669 | 0.858 |
| 0.053362322961829724 | 0.859 |
| 0.44470638880440005 | 0.86 |
| 0.2143534205714933 | 0.861 |
| 0.651950105150042 | 0.862 |
| 0.9154588677872555 | 0.863 |
| 0.8441389477930081 | 0.864 |
| 0.31204619722645593 | 0.865 |
| 0.0017073256243258347 | 0.866 |
| 0.7229160447189001 | 0.867 |
| 0.281587909969951 | 0.868 |
| 0.00040371049221882434 | 0.869 |
| 0.00027619422358391826 | 0.87 |
| 0.5004565766167044 | 0.871 |
| 0.06390930714214953 | 0.872 |
| 0.002760428473724497 | 0.873 |
| 0.1554615653788552 | 0.874 |
| 0.42321259239821096 | 0.875 |
| 0.36395851385955375 | 0.876 |
| 0.01212859050649095 | 0.877 |
| 0.010875917607945979 | 0.878 |
| 0.45397024183543155 | 0.879 |
| 0.11396732904544948 | 0.88 |
| 0.6321301175797398 | 0.881 |
| 0.8265854835587694 | 0.882 |
| 0.48186330970795505 | 0.883 |
| 0.09071332949197505 | 0.884 |
| 0.5067393129943697 | 0.885 |
| 0.4482476950917127 | 0.886 |
| 0.02338659619865414 | 0.887 |
| 0.1686472495773634 | 0.888 |
| 0.658853952475864 | 0.889 |
| 0.12545076907318548 | 0.89 |
| 0.14963559567484297 | 0.891 |
| 0.321993180048028 | 0.892 |
| 0.4094337102470714 | 0.893 |
| 0.5671515307890197 | 0.894 |
| 0.05495290598470405 | 0.895 |
| 0.5970561855369453 | 0.896 |
| 0.7564152931668214 | 0.897 |
| 0.7001070374480215 | 0.898 |
| 0.12497786271794542 | 0.899 |
| 0.013151197114317054 | 0.9 |
| 0.823757415505062 | 0.901 |
| 0.09263925823876963 | 0.902 |
| 0.4617520620188324 | 0.903 |
| 0.0676860431609006 | 0.904 |
| 0.04279212606859713 | 0.905 |
| 0.2675735531907869 | 0.906 |
| 0.004174439100043809 | 0.907 |
| 0.0034269893614005515 | 0.908 |
| 0.8660118369138303 | 0.909 |
| 0.23802466555130103 | 0.91 |
| 0.17640313122754953 | 0.911 |
| 0.19127128456981293 | 0.912 |
| 0.5618521593910533 | 0.913 |
| 0.44367433752137536 | 0.914 |
| 0.9088821904533286 | 0.915 |
| 0.650568172115976 | 0.916 |
| 0.02433406194717231 | 0.917 |
| 0.07728418996444802 | 0.918 |
| 0.00802617938919728 | 0.919 |
| 0.0074824379359241695 | 0.92 |
| 0.18668175969884174 | 0.921 |
| 0.8135858713240114 | 0.922 |
| 0.8190586033011006 | 0.923 |
| 0.05946113748143762 | 0.924 |
| 0.5647369554834384 | 0.925 |
| 0.44942025164636074 | 0.926 |
| 0.029454896312280904 | 0.927 |
| 0.033133849678308104 | 0.928 |
| 0.9497890154015901 | 0.929 |
| 0.6635728675620395 | 0.93 |
| 0.3555296085474742 | 0.931 |
| 0.8573663286253087 | 0.932 |
| 0.3981488261415444 | 0.933 |
| 0.311563454072647 | 0.934 |
| 0.029570356504924834 | 0.935 |
| 0.2899298649929178 | 0.936 |
| 1.1739292942326053e-07 | 0.937 |
| 0.12707571015709856 | 0.938 |
| 0.039859723385935325 | 0.939 |
| 0.18838745415088662 | 0.94 |
| 0.7500520690499982 | 0.941 |
| 0.38719577400759253 | 0.942 |
| 0.37097228382424596 | 0.943 |
| 0.6773768248586487 | 0.944 |
| 0.13256318560023417 | 0.945 |
| 0.00687851785489832 | 0.946 |
| 0.00030907993181597716 | 0.947 |
| 0.11811323309152623 | 0.948 |
| 0.22234555276982373 | 0.949 |
| 0.5827326746025985 | 0.95 |
| 0.850951520514711 | 0.951 |
| 0.6602940825884963 | 0.952 |
| 0.11201837443687307 | 0.953 |
| 0.7117792089280014 | 0.954 |
| 0.01671288843337407 | 0.955 |
| 0.43674128144861746 | 0.956 |
| 0.0024022494930265254 | 0.957 |
| 0.1334535078576195 | 0.958 |
| 0.3198032369379245 | 0.959 |
| 0.024591482625980796 | 0.96 |
| 0.35318606910939565 | 0.961 |
| 0.4421739157905596 | 0.962 |
| 0.13021503614905636 | 0.963 |
| 0.6805844920496404 | 0.964 |
| 0.34630549433138946 | 0.965 |
| 0.40356633728873403 | 0.966 |
| 0.12321093183422167 | 0.967 |
| 0.9777478880597343 | 0.968 |
| 0.7157689088409349 | 0.969 |
| 0.3853854667675589 | 0.97 |
| 0.007198460727289058 | 0.971 |
| 0.8053341318837335 | 0.972 |
| 0.4957731974986909 | 0.973 |
| 0.16545344475005988 | 0.974 |
| 0.011693441917336862 | 0.975 |
| 0.26134161523562244 | 0.976 |
| 0.8707139542044448 | 0.977 |
| 0.3425493646145989 | 0.978 |
| 0.0003702694468120199 | 0.979 |
| 0.10970959945968801 | 0.98 |
| 0.0020241794735509633 | 0.981 |
| 0.7844034419521282 | 0.982 |
| 0.20619672512440937 | 0.983 |
| 0.027190428235909028 | 0.984 |
| 0.586313152096734 | 0.985 |
| 0.505885866383261 | 0.986 |
| 0.8655470695344052 | 0.987 |
| 0.02059229843408636 | 0.988 |
| 0.8751097846915288 | 0.989 |
| 0.027508634788409092 | 0.99 |
| 0.8883406277989272 | 0.991 |
| 0.7585582998018491 | 0.992 |
| 0.0008187203973245846 | 0.993 |
| 0.22554985586048973 | 0.994 |
| 0.9111717031962738 | 0.995 |
| 0.047226454397786694 | 0.996 |
| 0.0673555841898789 | 0.997 |
| 0.054333931046144084 | 0.998 |
| 0.8596708168176269 | 0.999 |
| 0.7782960504116779 | 1 |